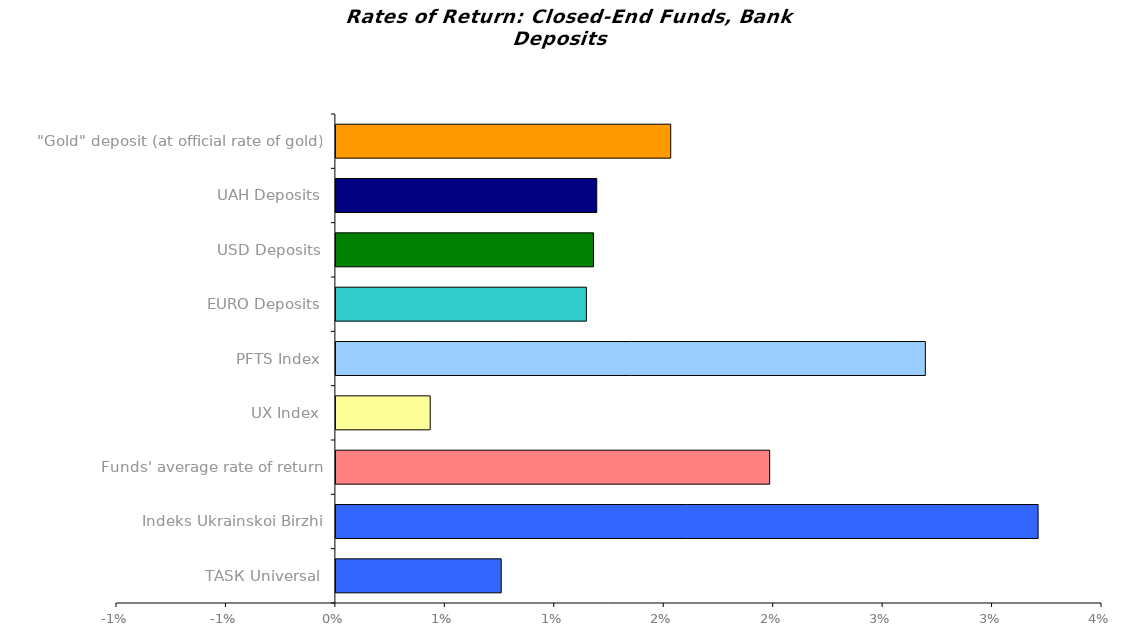
| Category | Series 0 |
|---|---|
| ТАSК Universal | 0.008 |
| Іndeks Ukrainskoi Birzhi | 0.032 |
| Funds' average rate of return | 0.02 |
| UX Index | 0.004 |
| PFTS Index | 0.027 |
| EURO Deposits | 0.011 |
| USD Deposits | 0.012 |
| UAH Deposits | 0.012 |
| "Gold" deposit (at official rate of gold) | 0.015 |